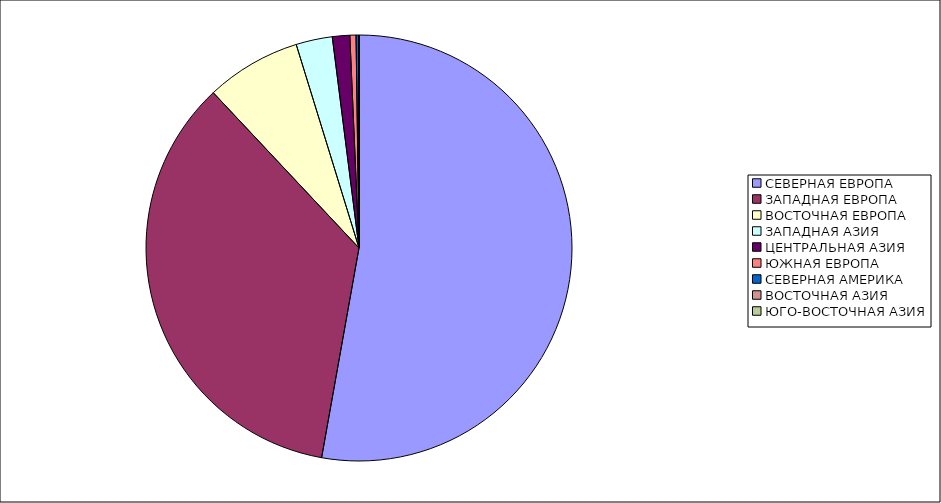
| Category | Оборот |
|---|---|
| СЕВЕРНАЯ ЕВРОПА | 52.808 |
| ЗАПАДНАЯ ЕВРОПА | 35.198 |
| ВОСТОЧНАЯ ЕВРОПА | 7.23 |
| ЗАПАДНАЯ АЗИЯ | 2.757 |
| ЦЕНТРАЛЬНАЯ АЗИЯ | 1.319 |
| ЮЖНАЯ ЕВРОПА | 0.467 |
| СЕВЕРНАЯ АМЕРИКА | 0.202 |
| ВОСТОЧНАЯ АЗИЯ | 0.018 |
| ЮГО-ВОСТОЧНАЯ АЗИЯ | 0 |